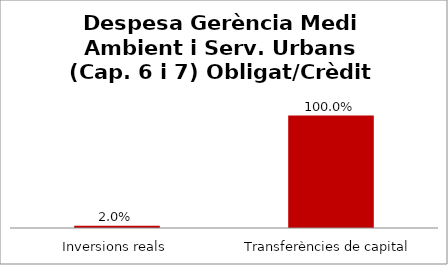
| Category | Series 0 |
|---|---|
| Inversions reals | 0.02 |
| Transferències de capital | 1 |